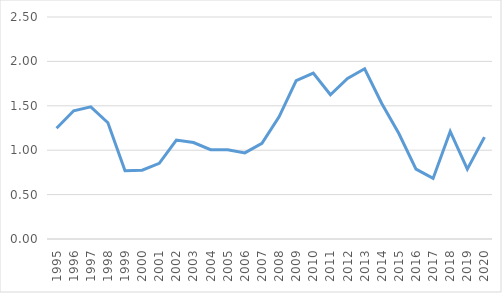
| Category | Series 0 |
|---|---|
| 1995.0 | 1.247 |
| 1996.0 | 1.443 |
| 1997.0 | 1.489 |
| 1998.0 | 1.309 |
| 1999.0 | 0.769 |
| 2000.0 | 0.774 |
| 2001.0 | 0.852 |
| 2002.0 | 1.114 |
| 2003.0 | 1.086 |
| 2004.0 | 1.006 |
| 2005.0 | 1.006 |
| 2006.0 | 0.97 |
| 2007.0 | 1.078 |
| 2008.0 | 1.376 |
| 2009.0 | 1.784 |
| 2010.0 | 1.869 |
| 2011.0 | 1.624 |
| 2012.0 | 1.808 |
| 2013.0 | 1.917 |
| 2014.0 | 1.527 |
| 2015.0 | 1.188 |
| 2016.0 | 0.788 |
| 2017.0 | 0.683 |
| 2018.0 | 1.211 |
| 2019.0 | 0.787 |
| 2020.0 | 1.148 |